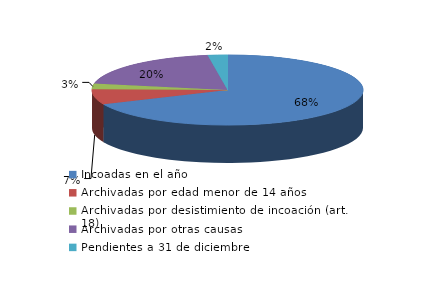
| Category | Series 0 |
|---|---|
| Incoadas en el año | 205 |
| Archivadas por edad menor de 14 años | 21 |
| Archivadas por desistimiento de incoación (art. 18) | 8 |
| Archivadas por otras causas | 59 |
| Pendientes a 31 de diciembre | 7 |